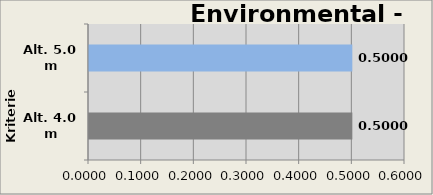
| Category | Env. - C |
|---|---|
| Alt. 4.0 m | 0.5 |
| Alt. 5.0 m | 0.5 |